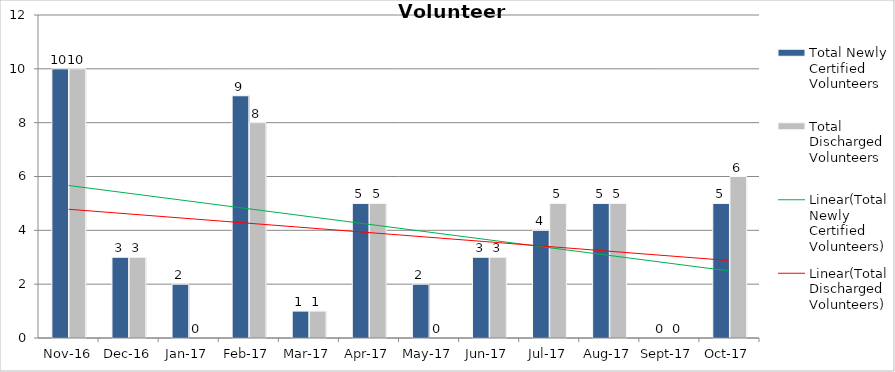
| Category | Total Newly Certified Volunteers | Total Discharged Volunteers |
|---|---|---|
| 2016-11-01 | 10 | 10 |
| 2016-12-01 | 3 | 3 |
| 2017-01-01 | 2 | 0 |
| 2017-02-01 | 9 | 8 |
| 2017-03-01 | 1 | 1 |
| 2017-04-01 | 5 | 5 |
| 2017-05-01 | 2 | 0 |
| 2017-06-01 | 3 | 3 |
| 2017-07-01 | 4 | 5 |
| 2017-08-01 | 5 | 5 |
| 2017-09-01 | 0 | 0 |
| 2017-10-01 | 5 | 6 |